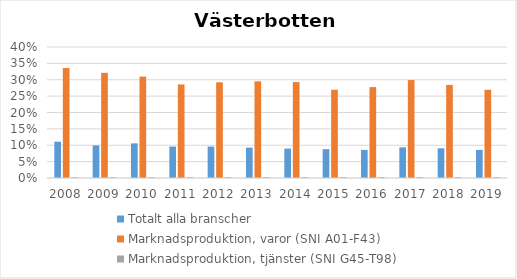
| Category | Totalt alla branscher | Marknadsproduktion, varor (SNI A01-F43) | Marknadsproduktion, tjänster (SNI G45-T98) |
|---|---|---|---|
| 2008 | 0.111 | 0.336 | 0.003 |
| 2009 | 0.1 | 0.321 | 0.002 |
| 2010 | 0.106 | 0.31 | 0.002 |
| 2011 | 0.096 | 0.286 | 0.003 |
| 2012 | 0.096 | 0.292 | 0.003 |
| 2013 | 0.093 | 0.295 | 0.003 |
| 2014 | 0.09 | 0.293 | 0.003 |
| 2015 | 0.088 | 0.27 | 0.003 |
| 2016 | 0.086 | 0.278 | 0.003 |
| 2017 | 0.093 | 0.299 | 0.003 |
| 2018 | 0.091 | 0.284 | 0.003 |
| 2019 | 0.086 | 0.269 | 0.003 |